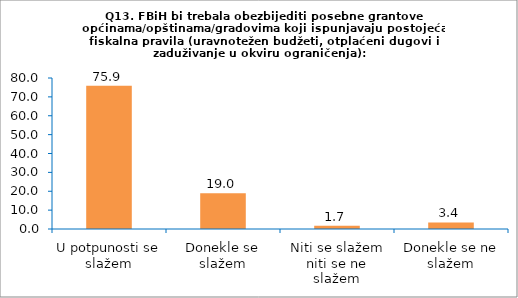
| Category | Series 0 |
|---|---|
| U potpunosti se slažem | 75.862 |
| Donekle se slažem | 18.966 |
| Niti se slažem niti se ne slažem | 1.724 |
| Donekle se ne slažem | 3.448 |